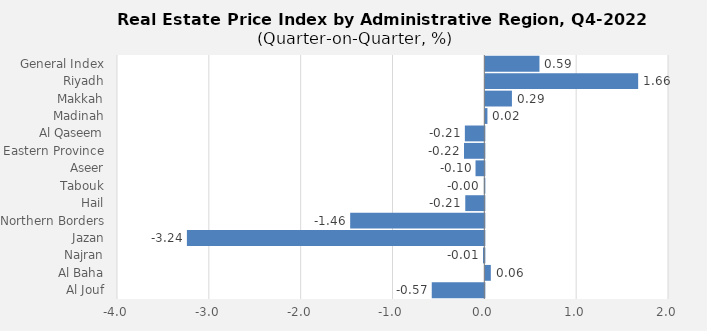
| Category | 2022 |
|---|---|
| General Index | 0.589 |
| Riyadh | 1.664 |
| Makkah | 0.29 |
| Madinah | 0.023 |
| Al Qaseem | -0.212 |
| Eastern Province | -0.221 |
| Aseer | -0.096 |
| Tabouk | -0.005 |
| Hail | -0.208 |
| Northern Borders | -1.461 |
| Jazan | -3.239 |
| Najran | -0.014 |
| Al Baha | 0.06 |
| Al Jouf | -0.573 |